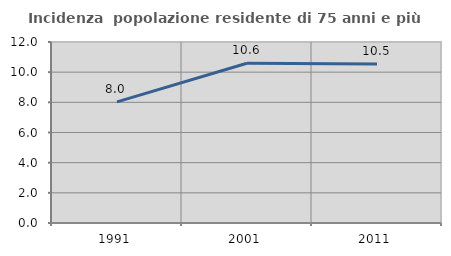
| Category | Incidenza  popolazione residente di 75 anni e più |
|---|---|
| 1991.0 | 8.028 |
| 2001.0 | 10.588 |
| 2011.0 | 10.541 |